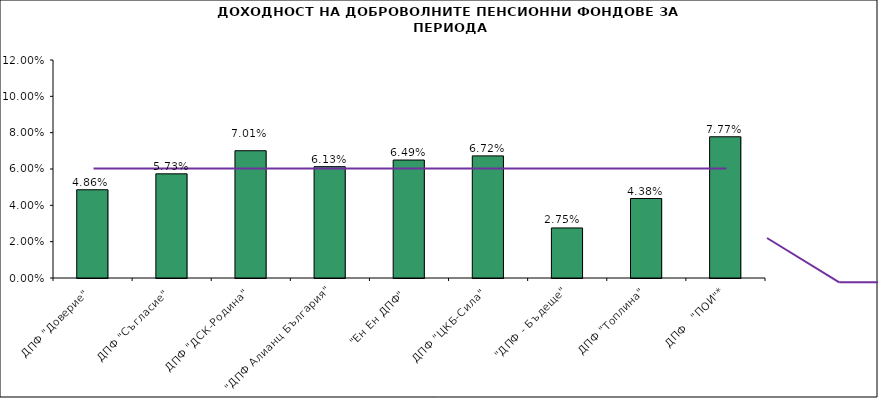
| Category | Series 0 |
|---|---|
| ДПФ "Доверие"  | 0.049 |
| ДПФ "Съгласие"  | 0.057 |
| ДПФ "ДСК-Родина"  | 0.07 |
| "ДПФ Алианц България"  | 0.061 |
| "Ен Ен ДПФ"  | 0.065 |
| ДПФ "ЦКБ-Сила"  | 0.067 |
| "ДПФ - Бъдеще" | 0.028 |
| ДПФ "Топлина" | 0.044 |
| ДПФ   "ПОИ"* | 0.078 |